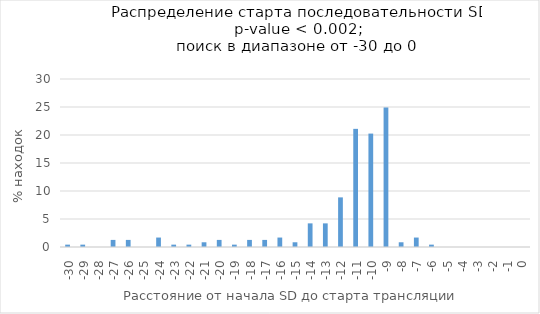
| Category | Series 0 |
|---|---|
| -30.0 | 0.422 |
| -29.0 | 0.422 |
| -28.0 | 0 |
| -27.0 | 1.266 |
| -26.0 | 1.266 |
| -25.0 | 0 |
| -24.0 | 1.688 |
| -23.0 | 0.422 |
| -22.0 | 0.422 |
| -21.0 | 0.844 |
| -20.0 | 1.266 |
| -19.0 | 0.422 |
| -18.0 | 1.266 |
| -17.0 | 1.266 |
| -16.0 | 1.688 |
| -15.0 | 0.844 |
| -14.0 | 4.219 |
| -13.0 | 4.219 |
| -12.0 | 8.861 |
| -11.0 | 21.097 |
| -10.0 | 20.253 |
| -9.0 | 24.895 |
| -8.0 | 0.844 |
| -7.0 | 1.688 |
| -6.0 | 0.422 |
| -5.0 | 0 |
| -4.0 | 0 |
| -3.0 | 0 |
| -2.0 | 0 |
| -1.0 | 0 |
| 0.0 | 0 |